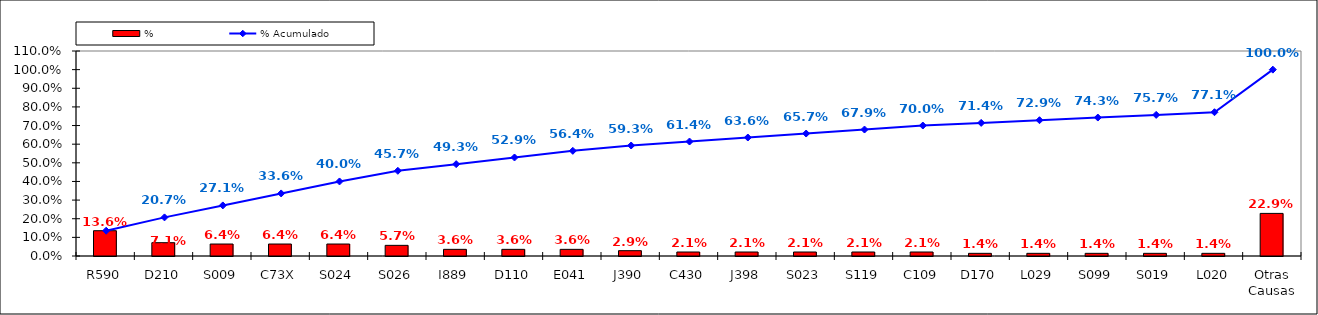
| Category | % |
|---|---|
| R590 | 0.136 |
| D210 | 0.071 |
| S009 | 0.064 |
| C73X | 0.064 |
| S024 | 0.064 |
| S026 | 0.057 |
| I889 | 0.036 |
| D110 | 0.036 |
| E041 | 0.036 |
| J390 | 0.029 |
| C430 | 0.021 |
| J398 | 0.021 |
| S023 | 0.021 |
| S119 | 0.021 |
| C109 | 0.021 |
| D170 | 0.014 |
| L029 | 0.014 |
| S099 | 0.014 |
| S019 | 0.014 |
| L020 | 0.014 |
| Otras Causas | 0.229 |